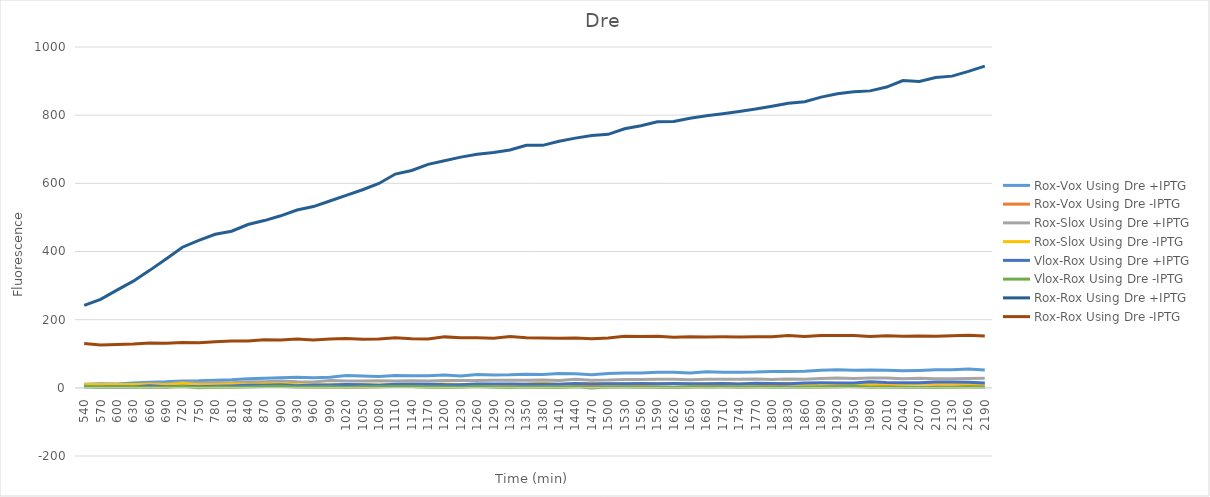
| Category | Rox-Vox Using Dre +IPTG | Rox-Vox Using Dre -IPTG | Rox-Slox Using Dre +IPTG | Rox-Slox Using Dre -IPTG | Vlox-Rox Using Dre +IPTG | Vlox-Rox Using Dre -IPTG | Rox-Rox Using Dre +IPTG | Rox-Rox Using Dre -IPTG |
|---|---|---|---|---|---|---|---|---|
| 540.0 | 10.25 | 4.5 | 7.75 | 10 | 2.5 | 4.5 | 241.75 | 130.25 |
| 570.0 | 12 | 2.5 | 9 | 9.5 | 2.75 | 1.75 | 259.5 | 126 |
| 600.0 | 11.5 | 2.5 | 9 | 9.75 | 3.25 | 2.25 | 286.75 | 127.5 |
| 630.0 | 14.25 | 3.75 | 9.25 | 10 | 2.5 | 2 | 313 | 128.25 |
| 660.0 | 16.375 | 1.875 | 12.375 | 9.625 | 5.875 | 1.625 | 344.625 | 131.375 |
| 690.0 | 17.5 | 2.75 | 11.25 | 8.75 | 3.5 | 1.5 | 378.25 | 131 |
| 720.0 | 20.125 | 4.375 | 15.375 | 12.375 | 4.875 | 3.625 | 412.625 | 132.875 |
| 750.0 | 20.5 | 2.5 | 14.25 | 9 | 3.5 | 0.25 | 432.5 | 132.25 |
| 780.0 | 22.125 | 1.875 | 15.625 | 9.375 | 4.375 | 2.125 | 450.625 | 135.375 |
| 810.0 | 24 | 3.25 | 15 | 11.25 | 5.5 | 1.5 | 459.5 | 137.25 |
| 840.0 | 27 | 4.75 | 18 | 9.75 | 7.25 | 2.5 | 479.25 | 137.75 |
| 870.0 | 28.25 | 4.5 | 17.75 | 11.5 | 7.5 | 3.75 | 490.75 | 141.25 |
| 900.0 | 29.5 | 4.25 | 20 | 12.25 | 8.75 | 4.5 | 504.75 | 140.5 |
| 930.0 | 30.875 | 3.375 | 17.875 | 9.625 | 5.875 | 2.125 | 521.625 | 143.125 |
| 960.0 | 29.625 | 2.625 | 17.375 | 8.625 | 8.375 | 2.125 | 531.875 | 140.625 |
| 990.0 | 31.25 | 2.25 | 21.25 | 9 | 8.25 | 3.25 | 548.25 | 143.25 |
| 1020.0 | 35.875 | 2.625 | 20.375 | 10.125 | 9.875 | 1.625 | 564.875 | 144.625 |
| 1050.0 | 34.375 | 1.875 | 19.875 | 10.125 | 9.375 | 3.375 | 581.125 | 142.875 |
| 1080.0 | 33.375 | 3.125 | 20.625 | 8.625 | 7.875 | 2.875 | 599.625 | 143.625 |
| 1110.0 | 36.5 | 4.5 | 20 | 10 | 10.75 | 3.75 | 627.25 | 146.75 |
| 1140.0 | 35.5 | 4.25 | 21 | 10.75 | 10.5 | 4 | 637.75 | 144 |
| 1170.0 | 35.375 | 3.125 | 20.125 | 9.625 | 10.875 | 1.375 | 655.625 | 143.125 |
| 1200.0 | 38 | 2.25 | 21.75 | 11.5 | 9.5 | 2.5 | 666.25 | 149.5 |
| 1230.0 | 34.875 | 3.875 | 21.375 | 9.875 | 9.375 | 1.375 | 676.875 | 146.875 |
| 1260.0 | 39.375 | 4.125 | 21.875 | 10.375 | 11.375 | 3.625 | 685.375 | 146.625 |
| 1290.0 | 37.75 | 5 | 22.25 | 10 | 11 | 2 | 690.75 | 145.25 |
| 1320.0 | 38.375 | 3.625 | 22.125 | 10.875 | 11.125 | 1.125 | 697.625 | 150.375 |
| 1350.0 | 40.125 | 2.875 | 22.375 | 11.125 | 10.625 | 1.875 | 711.625 | 146.625 |
| 1380.0 | 39 | 2.25 | 23 | 13.75 | 10.75 | 2.75 | 711.5 | 146 |
| 1410.0 | 41.875 | 1.125 | 21.375 | 10.875 | 10.875 | 1.625 | 723.625 | 145.125 |
| 1440.0 | 41.375 | 3.875 | 25.375 | 11.625 | 12.375 | 3.375 | 732.625 | 146.375 |
| 1470.0 | 38.625 | 4.375 | 22.125 | 12.625 | 11.125 | -0.375 | 740.375 | 144.375 |
| 1500.0 | 42.375 | 2.375 | 22.875 | 11.625 | 11.875 | 2.625 | 743.875 | 146.125 |
| 1530.0 | 43.75 | 3 | 24.75 | 12.25 | 12.25 | 2.75 | 760.25 | 151 |
| 1560.0 | 43.5 | 4.25 | 24.5 | 12 | 12.5 | 2 | 768.75 | 150.75 |
| 1590.0 | 45.625 | 2.125 | 25.125 | 11.625 | 11.875 | 2.375 | 780.375 | 151.625 |
| 1620.0 | 46 | 1.25 | 25.5 | 12 | 13 | 0.75 | 781.25 | 148.5 |
| 1650.0 | 43.625 | 2.375 | 23.625 | 11.125 | 12.125 | 2.875 | 791.125 | 150.125 |
| 1680.0 | 47.125 | 4.375 | 25.375 | 11.375 | 12.125 | 1.625 | 798.125 | 149.375 |
| 1710.0 | 45.625 | 3.875 | 24.875 | 12.375 | 12.875 | 2.625 | 804.125 | 149.625 |
| 1740.0 | 45.5 | 2 | 25 | 11.5 | 11.25 | 2.25 | 811 | 149.25 |
| 1770.0 | 46.25 | 3 | 26.25 | 12.75 | 13.5 | 2.75 | 818 | 150 |
| 1800.0 | 48.125 | 4.375 | 24.625 | 11.875 | 12.625 | 1.875 | 826.375 | 149.875 |
| 1830.0 | 48.25 | 3 | 25.75 | 13.75 | 12.25 | 2 | 834.75 | 153.25 |
| 1860.0 | 48.375 | 1.375 | 25.375 | 10.375 | 14.125 | 2.375 | 839.375 | 150.375 |
| 1890.0 | 51.25 | 2.75 | 27.5 | 13.75 | 14.75 | 3.25 | 853 | 153.25 |
| 1920.0 | 52.875 | 4.375 | 29.125 | 13.625 | 14.375 | 2.625 | 862.875 | 153.875 |
| 1950.0 | 51.375 | 3.375 | 27.125 | 11.625 | 13.875 | 4.375 | 868.625 | 153.375 |
| 1980.0 | 52.25 | 3.5 | 29 | 11.25 | 17.75 | 1.5 | 871.25 | 150.75 |
| 2010.0 | 51.75 | 4.75 | 28.75 | 11.25 | 15.75 | 1.75 | 882.5 | 152.5 |
| 2040.0 | 50.375 | 1.625 | 26.875 | 11.125 | 14.875 | 1.375 | 901.625 | 151.125 |
| 2070.0 | 51.125 | 1.375 | 27.875 | 12.375 | 14.625 | 1.875 | 899.125 | 151.875 |
| 2100.0 | 52.75 | 3.25 | 26.75 | 13.5 | 16.75 | 1.25 | 910.75 | 151.25 |
| 2130.0 | 52.75 | 2.75 | 26.5 | 11.75 | 17.25 | 2 | 914.5 | 152.5 |
| 2160.0 | 55.375 | 3.625 | 27.125 | 11.625 | 16.375 | 2.125 | 928.375 | 154.125 |
| 2190.0 | 52.5 | 2.75 | 28 | 12.25 | 14 | 2.75 | 944 | 151.75 |